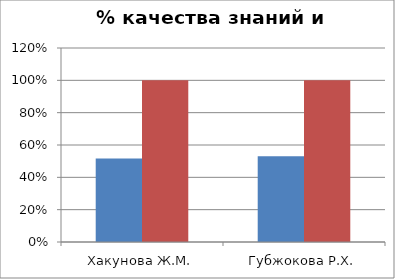
| Category | Series 0 | 2 |
|---|---|---|
| Хакунова Ж.М. | 0.517 | 1 |
| Губжокова Р.Х. | 0.531 | 1 |